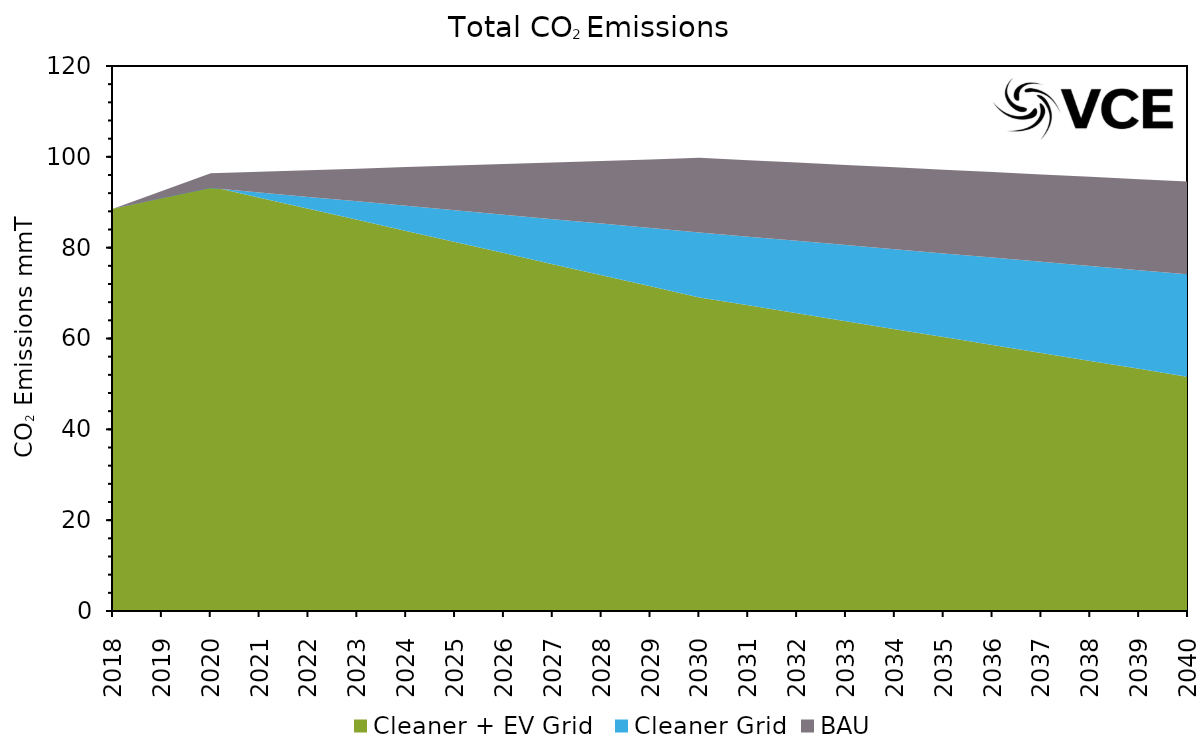
| Category | Cleaner + EV Grid  | Cleaner Grid | BAU |
|---|---|---|---|
| 2018.0 | 88.579 | 0 | 0 |
| 2019.0 | 91.01 | -0.155 | 1.625 |
| 2020.0 | 93.441 | -0.311 | 3.25 |
| 2021.0 | 91.001 | 1.151 | 4.568 |
| 2022.0 | 88.562 | 2.612 | 5.886 |
| 2023.0 | 86.123 | 4.073 | 7.204 |
| 2024.0 | 83.684 | 5.534 | 8.522 |
| 2025.0 | 81.245 | 6.995 | 9.84 |
| 2026.0 | 78.806 | 8.456 | 11.158 |
| 2027.0 | 76.367 | 9.917 | 12.476 |
| 2028.0 | 73.928 | 11.378 | 13.794 |
| 2029.0 | 71.489 | 12.839 | 15.112 |
| 2030.0 | 69.05 | 14.3 | 16.43 |
| 2031.0 | 67.301 | 15.126 | 16.83 |
| 2032.0 | 65.553 | 15.951 | 17.23 |
| 2033.0 | 63.805 | 16.776 | 17.63 |
| 2034.0 | 62.056 | 17.602 | 18.03 |
| 2035.0 | 60.308 | 18.427 | 18.43 |
| 2036.0 | 58.559 | 19.253 | 18.83 |
| 2037.0 | 56.811 | 20.078 | 19.23 |
| 2038.0 | 55.062 | 20.904 | 19.63 |
| 2039.0 | 53.314 | 21.729 | 20.03 |
| 2040.0 | 51.565 | 22.555 | 20.43 |